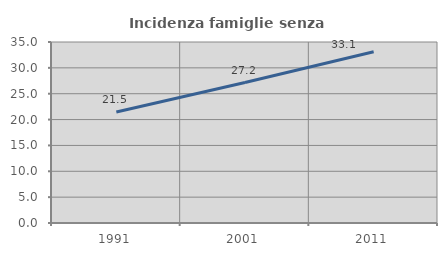
| Category | Incidenza famiglie senza nuclei |
|---|---|
| 1991.0 | 21.464 |
| 2001.0 | 27.157 |
| 2011.0 | 33.128 |